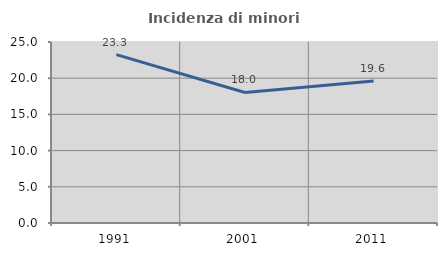
| Category | Incidenza di minori stranieri |
|---|---|
| 1991.0 | 23.256 |
| 2001.0 | 18.033 |
| 2011.0 | 19.623 |